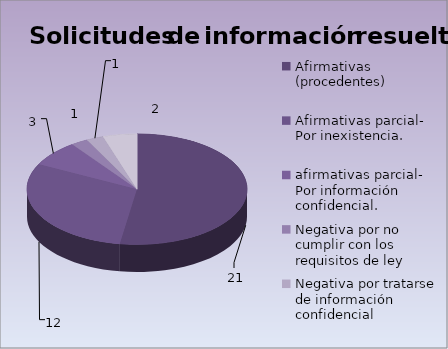
| Category | Series 0 |
|---|---|
| Afirmativas (procedentes) | 21 |
| Afirmativas parcial- Por inexistencia.                                                                                 | 12 |
| afirmativas parcial- Por información confidencial.                                                                                 | 3 |
| Negativa por no cumplir con los requisitos de ley | 1 |
| Negativa por tratarse de información confidencial                                                                                                                                                                                                               | 1 |
| Negativa por inexistencia                                                                                                                                                                                                                                       | 2 |